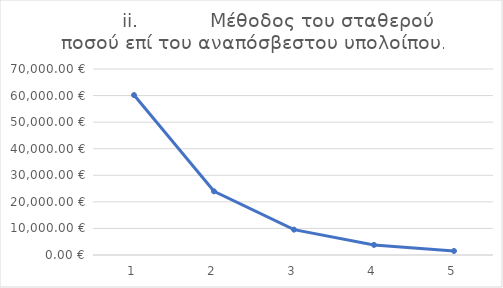
| Category |         ii.            Μέθοδος του σταθερού ποσού επί του αναπόσβεστου υπολοίπου. |
|---|---|
| 1.0 | 60189.283 |
| 2.0 | 23961.785 |
| 3.0 | 9539.358 |
| 4.0 | 3797.687 |
| 5.0 | 1511.886 |